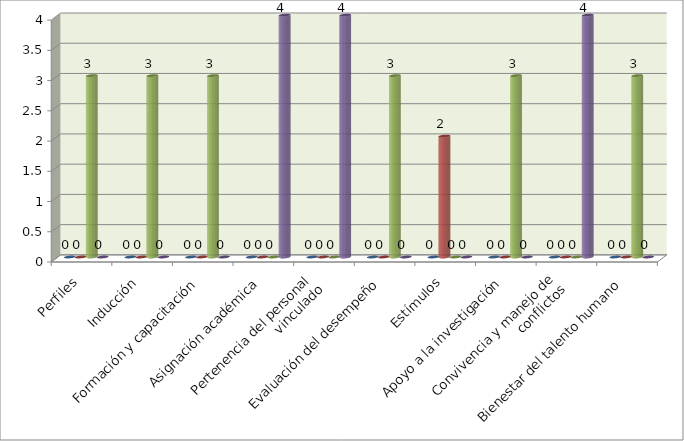
| Category | Series 0 | Series 1 | Series 2 | Series 3 |
|---|---|---|---|---|
| Perfiles | 0 | 0 | 3 | 0 |
| Inducción | 0 | 0 | 3 | 0 |
| Formación y capacitación | 0 | 0 | 3 | 0 |
| Asignación académica | 0 | 0 | 0 | 4 |
| Pertenencia del personal
vinculado | 0 | 0 | 0 | 4 |
| Evaluación del desempeño | 0 | 0 | 3 | 0 |
| Estímulos | 0 | 2 | 0 | 0 |
| Apoyo a la investigación | 0 | 0 | 3 | 0 |
| Convivencia y manejo de
conflictos | 0 | 0 | 0 | 4 |
| Bienestar del talento humano | 0 | 0 | 3 | 0 |